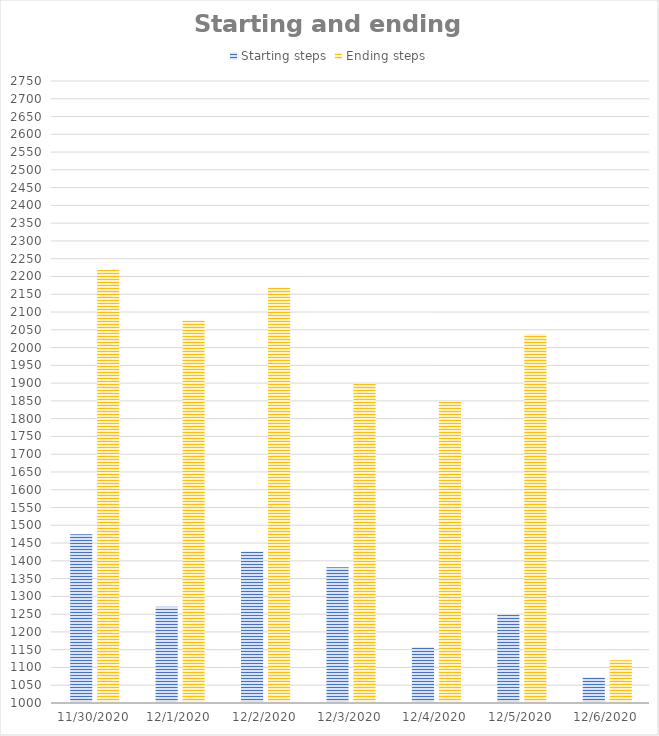
| Category | Starting steps | Ending steps |
|---|---|---|
| 11/30/20 | 1475 | 2219 |
| 12/1/20 | 1271 | 2076 |
| 12/2/20 | 1426 | 2168 |
| 12/3/20 | 1382 | 1899 |
| 12/4/20 | 1157 | 1848 |
| 12/5/20 | 1249 | 2038 |
| 12/6/20 | 1072 | 1120 |